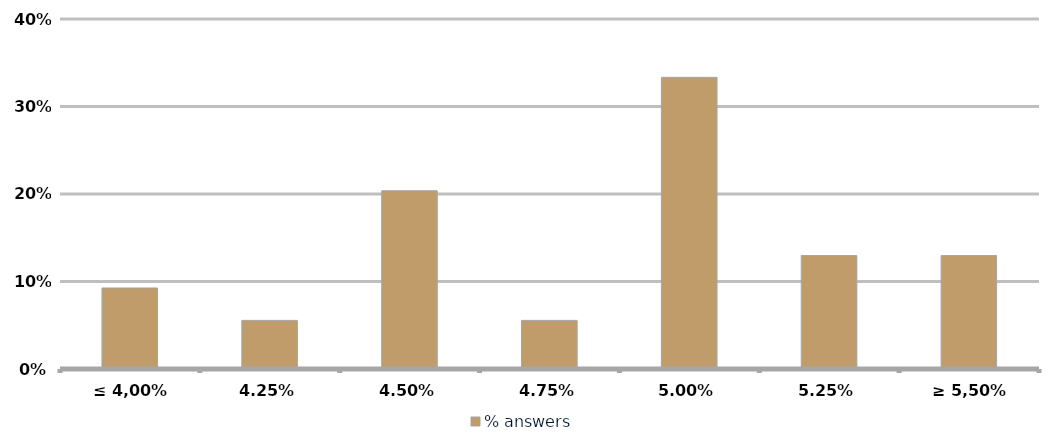
| Category | % answers |
|---|---|
| ≤ 4,00% | 0.093 |
| 4,25% | 0.056 |
| 4,50% | 0.204 |
| 4,75% | 0.056 |
| 5,00% | 0.333 |
| 5,25% | 0.13 |
| ≥ 5,50% | 0.13 |